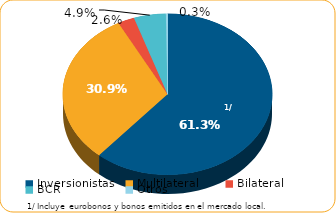
| Category | Series 0 |
|---|---|
| Inversionistas | 8753.4 |
| Multilateral | 4417.1 |
| Bilateral | 366.2 |
| BCR | 704.3 |
| Otros | 36.3 |